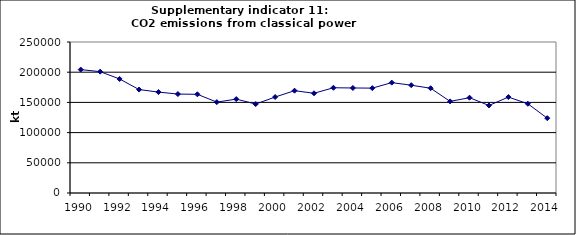
| Category | CO2 emissions from classical power production, kt |
|---|---|
| 1990 | 204305.032 |
| 1991 | 200900.46 |
| 1992 | 188795.28 |
| 1993 | 171261.364 |
| 1994 | 167067.753 |
| 1995 | 163801.166 |
| 1996 | 163391.328 |
| 1997 | 150441.281 |
| 1998 | 155465.546 |
| 1999 | 147230.874 |
| 2000 | 158884.343 |
| 2001 | 169404.807 |
| 2002 | 165103.357 |
| 2003 | 174253.292 |
| 2004 | 173876.806 |
| 2005 | 173626.348 |
| 2006 | 182759.951 |
| 2007 | 178497.017 |
| 2008 | 173437.001 |
| 2009 | 151684.17 |
| 2010 | 157798.086 |
| 2011 | 144916.149 |
| 2012 | 158819.681 |
| 2013 | 147748.393 |
| 2014 | 123845.549 |